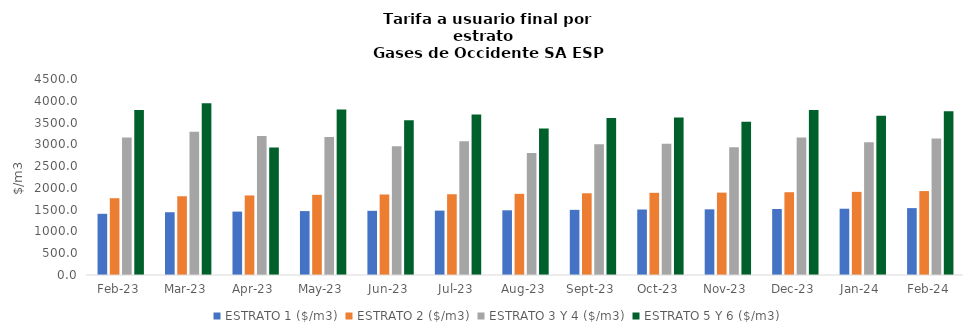
| Category | ESTRATO 1 ($/m3) | ESTRATO 2 ($/m3) | ESTRATO 3 Y 4 ($/m3) | ESTRATO 5 Y 6 ($/m3) |
|---|---|---|---|---|
| 2023-02-01 | 1405.01 | 1763.25 | 3155.49 | 3786.588 |
| 2023-03-01 | 1440.79 | 1807.57 | 3288.4 | 3946.08 |
| 2023-04-01 | 1455.91 | 1826.55 | 3194.1 | 2929.63 |
| 2023-05-01 | 1467.27 | 1840.8 | 3166.38 | 3799.656 |
| 2023-06-01 | 1473.58 | 1848.72 | 2958.7 | 3550.44 |
| 2023-07-01 | 1478 | 1854.26 | 3071.96 | 3686.352 |
| 2023-08-01 | 1485.39 | 1863.53 | 2800.92 | 3361.104 |
| 2023-09-01 | 1495.79 | 1876.58 | 3003.77 | 3604.524 |
| 2023-10-01 | 1503.86 | 1886.71 | 3011.88 | 3614.256 |
| 2023-11-01 | 1507.62 | 1891.43 | 2933.28 | 3519.936 |
| 2023-12-01 | 1514.69 | 1900.29 | 3156.1 | 3787.32 |
| 2024-01-01 | 1521.53 | 1908.87 | 3048.21 | 3657.852 |
| 2024-02-01 | 1535.52 | 1926.43 | 3133.79 | 3760.548 |